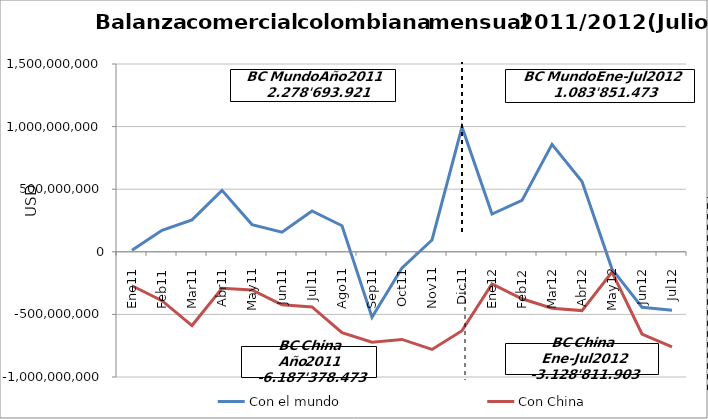
| Category | Con el mundo | Con China |
|---|---|---|
| 0 | 12976228.07 | -271387425.83 |
| 1 | 172080876.66 | -390217904.69 |
| 2 | 254737279.24 | -588946067.93 |
| 3 | 491095442.31 | -290872818.61 |
| 4 | 217317087.62 | -304658025.3 |
| 5 | 156393086.3 | -423376380.03 |
| 6 | 326134966.39 | -440423063.2 |
| 7 | 208345592.97 | -646199309.62 |
| 8 | -522891907.61 | -722053527.66 |
| 9 | -128564369.04 | -699899415.71 |
| 10 | 94315805.83 | -779540891.13 |
| 11 | 996753832.74 | -629803642.86 |
| 12 | 301773207.39 | -256179728.21 |
| 13 | 410189041.25 | -375231610.13 |
| 14 | 857833423.7 | -450950286.02 |
| 15 | 561075382.57 | -469469928.13 |
| 16 | -138077862.03 | -161193729.24 |
| 17 | -442796860.29 | -656649278.21 |
| 18 | -466144859.55 | -759137343.5 |